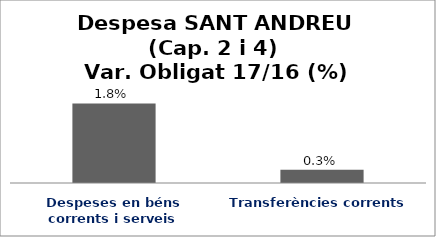
| Category | Series 0 |
|---|---|
| Despeses en béns corrents i serveis | 0.018 |
| Transferències corrents | 0.003 |